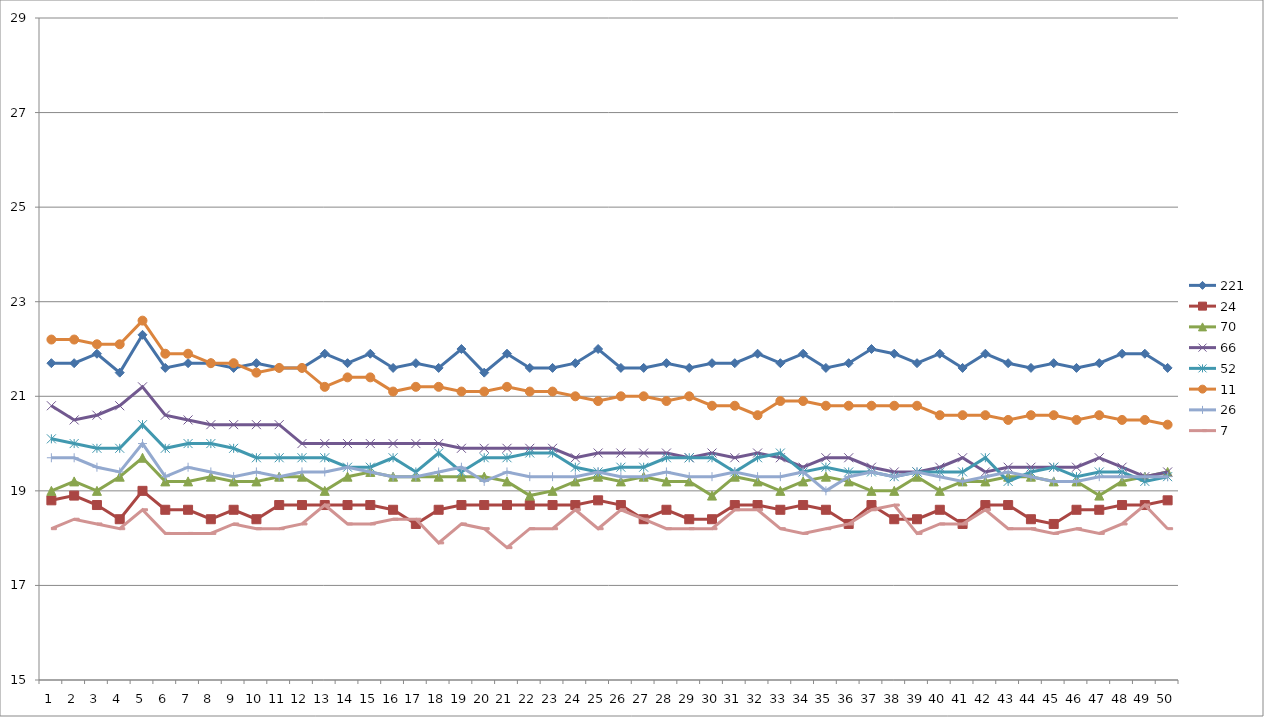
| Category | 221 | 24 | 70 | 66 | 52 | 11 | 26 | 7 |
|---|---|---|---|---|---|---|---|---|
| 0 | 21.7 | 18.8 | 19 | 20.8 | 20.1 | 22.2 | 19.7 | 18.2 |
| 1 | 21.7 | 18.9 | 19.2 | 20.5 | 20 | 22.2 | 19.7 | 18.4 |
| 2 | 21.9 | 18.7 | 19 | 20.6 | 19.9 | 22.1 | 19.5 | 18.3 |
| 3 | 21.5 | 18.4 | 19.3 | 20.8 | 19.9 | 22.1 | 19.4 | 18.2 |
| 4 | 22.3 | 19 | 19.7 | 21.2 | 20.4 | 22.6 | 20 | 18.6 |
| 5 | 21.6 | 18.6 | 19.2 | 20.6 | 19.9 | 21.9 | 19.3 | 18.1 |
| 6 | 21.7 | 18.6 | 19.2 | 20.5 | 20 | 21.9 | 19.5 | 18.1 |
| 7 | 21.7 | 18.4 | 19.3 | 20.4 | 20 | 21.7 | 19.4 | 18.1 |
| 8 | 21.6 | 18.6 | 19.2 | 20.4 | 19.9 | 21.7 | 19.3 | 18.3 |
| 9 | 21.7 | 18.4 | 19.2 | 20.4 | 19.7 | 21.5 | 19.4 | 18.2 |
| 10 | 21.6 | 18.7 | 19.3 | 20.4 | 19.7 | 21.6 | 19.3 | 18.2 |
| 11 | 21.6 | 18.7 | 19.3 | 20 | 19.7 | 21.6 | 19.4 | 18.3 |
| 12 | 21.9 | 18.7 | 19 | 20 | 19.7 | 21.2 | 19.4 | 18.7 |
| 13 | 21.7 | 18.7 | 19.3 | 20 | 19.5 | 21.4 | 19.5 | 18.3 |
| 14 | 21.9 | 18.7 | 19.4 | 20 | 19.5 | 21.4 | 19.4 | 18.3 |
| 15 | 21.6 | 18.6 | 19.3 | 20 | 19.7 | 21.1 | 19.3 | 18.4 |
| 16 | 21.7 | 18.3 | 19.3 | 20 | 19.4 | 21.2 | 19.3 | 18.4 |
| 17 | 21.6 | 18.6 | 19.3 | 20 | 19.8 | 21.2 | 19.4 | 17.9 |
| 18 | 22 | 18.7 | 19.3 | 19.9 | 19.4 | 21.1 | 19.5 | 18.3 |
| 19 | 21.5 | 18.7 | 19.3 | 19.9 | 19.7 | 21.1 | 19.2 | 18.2 |
| 20 | 21.9 | 18.7 | 19.2 | 19.9 | 19.7 | 21.2 | 19.4 | 17.8 |
| 21 | 21.6 | 18.7 | 18.9 | 19.9 | 19.8 | 21.1 | 19.3 | 18.2 |
| 22 | 21.6 | 18.7 | 19 | 19.9 | 19.8 | 21.1 | 19.3 | 18.2 |
| 23 | 21.7 | 18.7 | 19.2 | 19.7 | 19.5 | 21 | 19.3 | 18.6 |
| 24 | 22 | 18.8 | 19.3 | 19.8 | 19.4 | 20.9 | 19.4 | 18.2 |
| 25 | 21.6 | 18.7 | 19.2 | 19.8 | 19.5 | 21 | 19.3 | 18.6 |
| 26 | 21.6 | 18.4 | 19.3 | 19.8 | 19.5 | 21 | 19.3 | 18.4 |
| 27 | 21.7 | 18.6 | 19.2 | 19.8 | 19.7 | 20.9 | 19.4 | 18.2 |
| 28 | 21.6 | 18.4 | 19.2 | 19.7 | 19.7 | 21 | 19.3 | 18.2 |
| 29 | 21.7 | 18.4 | 18.9 | 19.8 | 19.7 | 20.8 | 19.3 | 18.2 |
| 30 | 21.7 | 18.7 | 19.3 | 19.7 | 19.4 | 20.8 | 19.4 | 18.6 |
| 31 | 21.9 | 18.7 | 19.2 | 19.8 | 19.7 | 20.6 | 19.3 | 18.6 |
| 32 | 21.7 | 18.6 | 19 | 19.7 | 19.8 | 20.9 | 19.3 | 18.2 |
| 33 | 21.9 | 18.7 | 19.2 | 19.5 | 19.4 | 20.9 | 19.4 | 18.1 |
| 34 | 21.6 | 18.6 | 19.3 | 19.7 | 19.5 | 20.8 | 19 | 18.2 |
| 35 | 21.7 | 18.3 | 19.2 | 19.7 | 19.4 | 20.8 | 19.3 | 18.3 |
| 36 | 22 | 18.7 | 19 | 19.5 | 19.4 | 20.8 | 19.4 | 18.6 |
| 37 | 21.9 | 18.4 | 19 | 19.4 | 19.3 | 20.8 | 19.3 | 18.7 |
| 38 | 21.7 | 18.4 | 19.3 | 19.4 | 19.4 | 20.8 | 19.4 | 18.1 |
| 39 | 21.9 | 18.6 | 19 | 19.5 | 19.4 | 20.6 | 19.3 | 18.3 |
| 40 | 21.6 | 18.3 | 19.2 | 19.7 | 19.4 | 20.6 | 19.2 | 18.3 |
| 41 | 21.9 | 18.7 | 19.2 | 19.4 | 19.7 | 20.6 | 19.3 | 18.6 |
| 42 | 21.7 | 18.7 | 19.3 | 19.5 | 19.2 | 20.5 | 19.4 | 18.2 |
| 43 | 21.6 | 18.4 | 19.3 | 19.5 | 19.4 | 20.6 | 19.3 | 18.2 |
| 44 | 21.7 | 18.3 | 19.2 | 19.5 | 19.5 | 20.6 | 19.2 | 18.1 |
| 45 | 21.6 | 18.6 | 19.2 | 19.5 | 19.3 | 20.5 | 19.2 | 18.2 |
| 46 | 21.7 | 18.6 | 18.9 | 19.7 | 19.4 | 20.6 | 19.3 | 18.1 |
| 47 | 21.9 | 18.7 | 19.2 | 19.5 | 19.4 | 20.5 | 19.3 | 18.3 |
| 48 | 21.9 | 18.7 | 19.3 | 19.3 | 19.2 | 20.5 | 19.3 | 18.7 |
| 49 | 21.6 | 18.8 | 19.4 | 19.4 | 19.3 | 20.4 | 19.3 | 18.2 |